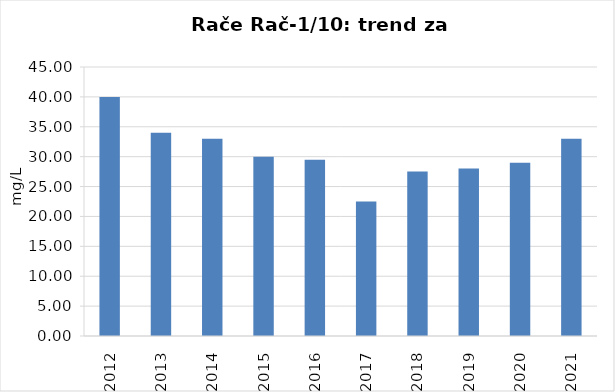
| Category | Vsota |
|---|---|
| 2012 | 40 |
| 2013 | 34 |
| 2014 | 33 |
| 2015 | 30 |
| 2016 | 29.5 |
| 2017 | 22.5 |
| 2018 | 27.5 |
| 2019 | 28 |
| 2020 | 29 |
| 2021 | 33 |